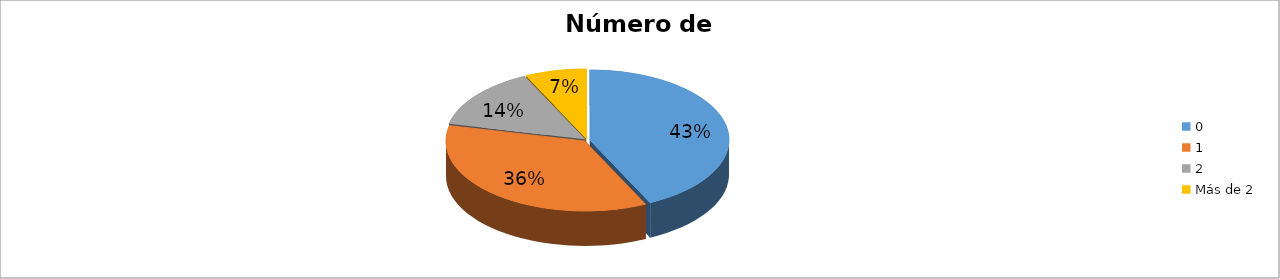
| Category | Series 0 |
|---|---|
| 0 | 0.429 |
| 1 | 0.357 |
| 2 | 0.143 |
| Más de 2 | 0.071 |